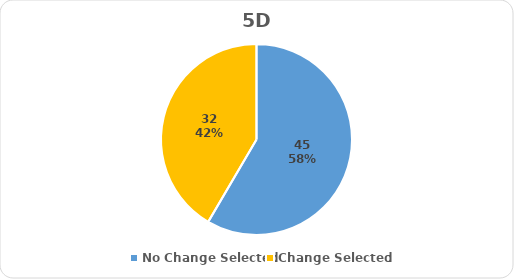
| Category | Series 0 |
|---|---|
| No Change Selected | 45 |
| Change Selected | 32 |